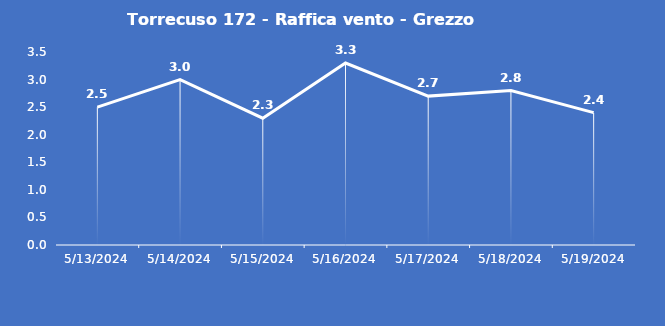
| Category | Torrecuso 172 - Raffica vento - Grezzo (m/s) |
|---|---|
| 5/13/24 | 2.5 |
| 5/14/24 | 3 |
| 5/15/24 | 2.3 |
| 5/16/24 | 3.3 |
| 5/17/24 | 2.7 |
| 5/18/24 | 2.8 |
| 5/19/24 | 2.4 |